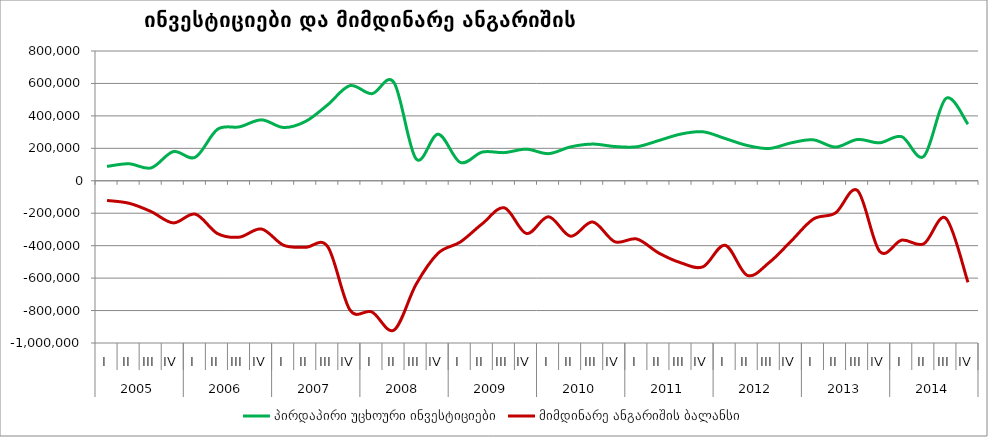
| Category | პირდაპირი უცხოური ინვესტიციები | მიმდინარე ანგარიშის ბალანსი |
|---|---|---|
| 0 | 88646.325 | -121317.826 |
| 1 | 104771.754 | -138686.462 |
| 2 | 79588.321 | -190040.638 |
| 3 | 179745.892 | -259679.481 |
| 4 | 145203.515 | -205785.051 |
| 5 | 316930.326 | -325107.765 |
| 6 | 332432.357 | -347206.456 |
| 7 | 375511.195 | -297419.742 |
| 8 | 328417.762 | -397417.415 |
| 9 | 366532.846 | -409873.494 |
| 10 | 468921.824 | -406761.306 |
| 11 | 586370.156 | -795317.668 |
| 12 | 536827.152 | -808730.482 |
| 13 | 605354.362 | -920271.026 |
| 14 | 134934.364 | -638128.567 |
| 15 | 287195.245 | -446140.506 |
| 16 | 113258.011 | -377668.747 |
| 17 | 177078.707 | -264716.738 |
| 18 | 173742.079 | -166744.468 |
| 19 | 194816.23 | -325204.68 |
| 20 | 167328.046 | -221716.792 |
| 21 | 209050.277 | -341637.258 |
| 22 | 226291.93 | -253809.599 |
| 23 | 211167.205 | -375669.061 |
| 24 | 209720.039 | -358948.889 |
| 25 | 248335.384 | -445829.438 |
| 26 | 288189.95 | -505897.451 |
| 27 | 301987.794 | -529935.313 |
| 28 | 260549.232 | -397462.444 |
| 29 | 217650.289 | -583127.419 |
| 30 | 199055.274 | -503459.413 |
| 31 | 234030.936 | -370292.595 |
| 32 | 252195.324 | -235695.151 |
| 33 | 207908.951 | -198329.527 |
| 34 | 254825.109 | -60710.924 |
| 35 | 234006.064 | -435191.587 |
| 36 | 271804.198 | -365875.285 |
| 37 | 150746.213 | -388367.685 |
| 38 | 507445.454 | -231166.618 |
| 39 | 349150.611 | -625866.687 |